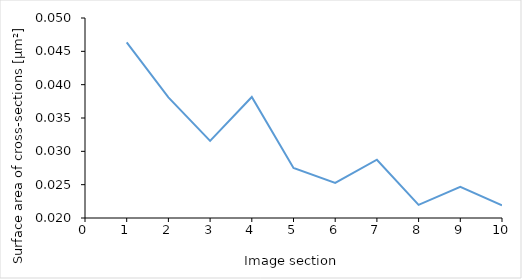
| Category | Series 0 |
|---|---|
| 1.0 | 0.046 |
| 2.0 | 0.038 |
| 3.0 | 0.032 |
| 4.0 | 0.038 |
| 5.0 | 0.028 |
| 6.0 | 0.025 |
| 7.0 | 0.029 |
| 8.0 | 0.022 |
| 9.0 | 0.025 |
| 10.0 | 0.022 |